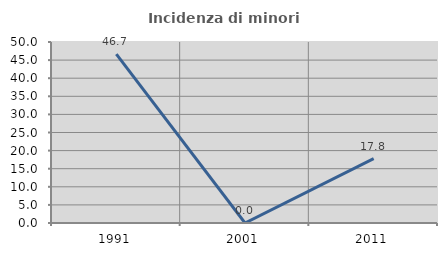
| Category | Incidenza di minori stranieri |
|---|---|
| 1991.0 | 46.667 |
| 2001.0 | 0 |
| 2011.0 | 17.778 |